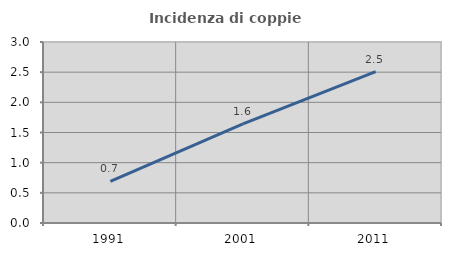
| Category | Incidenza di coppie miste |
|---|---|
| 1991.0 | 0.691 |
| 2001.0 | 1.644 |
| 2011.0 | 2.508 |